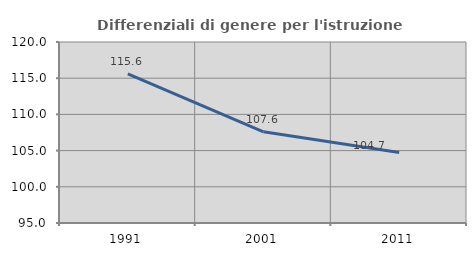
| Category | Differenziali di genere per l'istruzione superiore |
|---|---|
| 1991.0 | 115.612 |
| 2001.0 | 107.591 |
| 2011.0 | 104.746 |